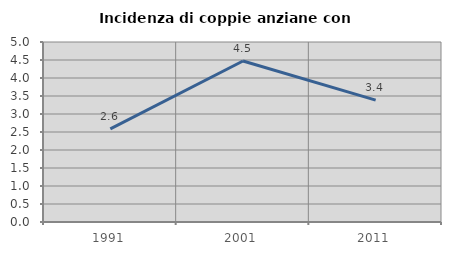
| Category | Incidenza di coppie anziane con figli |
|---|---|
| 1991.0 | 2.588 |
| 2001.0 | 4.472 |
| 2011.0 | 3.387 |